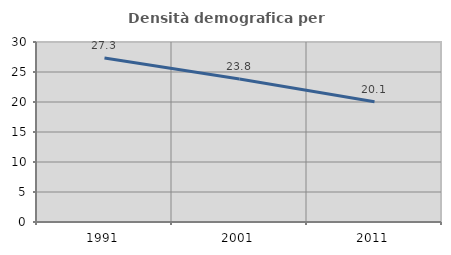
| Category | Densità demografica |
|---|---|
| 1991.0 | 27.349 |
| 2001.0 | 23.832 |
| 2011.0 | 20.052 |